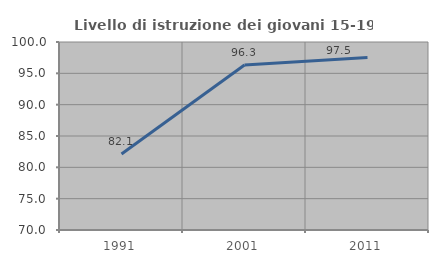
| Category | Livello di istruzione dei giovani 15-19 anni |
|---|---|
| 1991.0 | 82.12 |
| 2001.0 | 96.341 |
| 2011.0 | 97.544 |